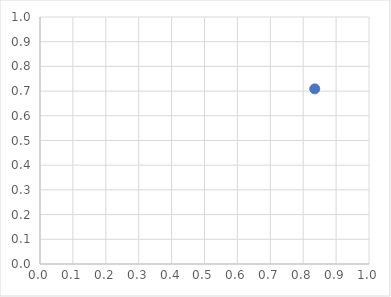
| Category | pont |
|---|---|
| 0.8350128391547578 | 0.709 |